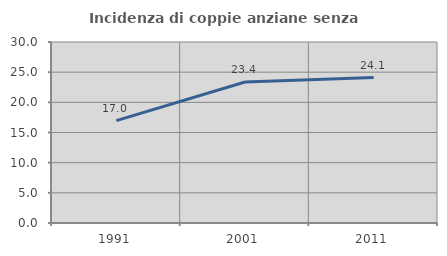
| Category | Incidenza di coppie anziane senza figli  |
|---|---|
| 1991.0 | 16.962 |
| 2001.0 | 23.38 |
| 2011.0 | 24.104 |